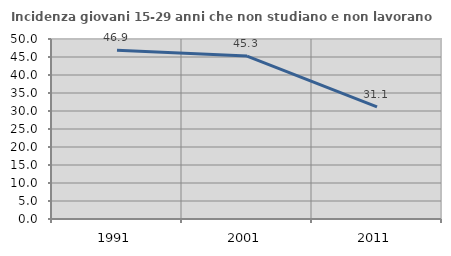
| Category | Incidenza giovani 15-29 anni che non studiano e non lavorano  |
|---|---|
| 1991.0 | 46.906 |
| 2001.0 | 45.272 |
| 2011.0 | 31.144 |